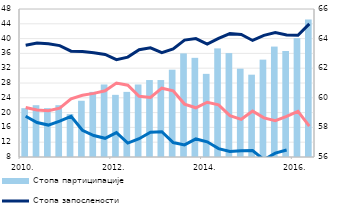
| Category | Стопа партиципације  |
|---|---|
| 2010. | 59.3 |
| II | 59.5 |
| III | 59.3 |
| IV | 59.5 |
| 2011. | 58.9 |
| II | 59.8 |
| III | 60.4 |
| IV | 60.9 |
| 2012. | 60.2 |
| II | 60.4 |
| III | 60.9 |
| IV | 61.2 |
| 2013. | 61.2 |
| II | 61.9 |
| III | 63 |
| IV | 62.7 |
| 2014. | 61.618 |
| II | 63.339 |
| III | 63.021 |
| IV | 61.968 |
| 2015. | 61.562 |
| II | 62.578 |
| III | 63.461 |
| IV | 63.162 |
| 2016. | 64.03 |
| II | 65.299 |